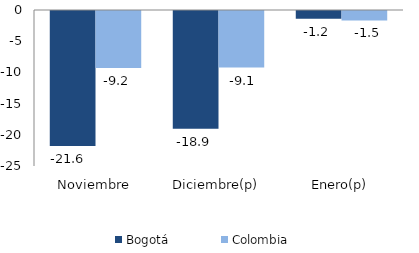
| Category | Bogotá | Colombia |
|---|---|---|
| Noviembre | -21.633 | -9.153 |
| Diciembre(p) | -18.865 | -9.059 |
| Enero(p) | -1.249 | -1.513 |